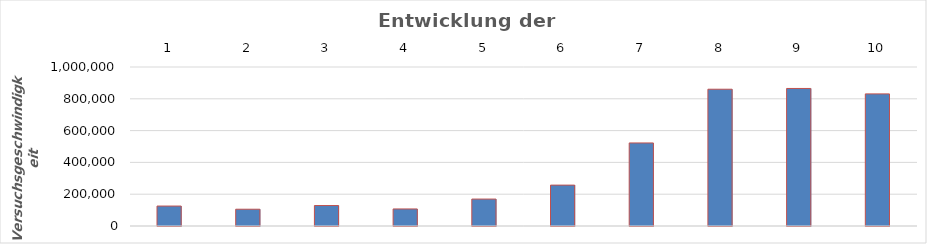
| Category | TR01 TR02 TR03 TR04 TR05 SB01 SB02 SB03 SB04 SB05 | Series 1 |
|---|---|---|
| 0 | 125486.519 |  |
| 1 | 105500 |  |
| 2 | 128653.444 |  |
| 3 | 107160.569 |  |
| 4 | 169325.73 |  |
| 5 | 257150.045 |  |
| 6 | 522363.194 |  |
| 7 | 860176.253 |  |
| 8 | 865016.84 |  |
| 9 | 830897.55 |  |